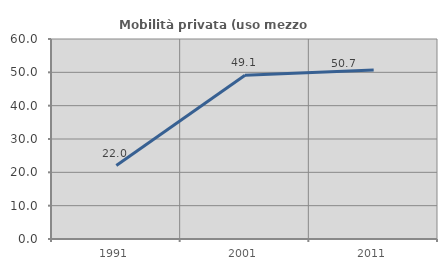
| Category | Mobilità privata (uso mezzo privato) |
|---|---|
| 1991.0 | 22.037 |
| 2001.0 | 49.145 |
| 2011.0 | 50.669 |